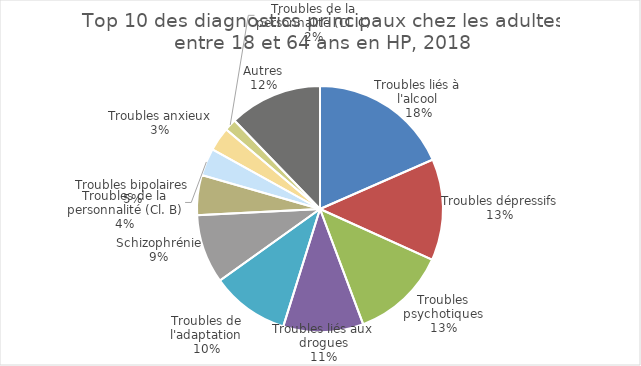
| Category | Fréquence |
|---|---|
| Troubles liés à l'alcool | 8206 |
| Troubles dépressifs | 5933 |
| Troubles psychotiques | 5582 |
| Troubles liés aux drogues | 4688 |
| Troubles de l'adaptation | 4582 |
| Schizophrénie | 4042 |
| Troubles bipolaires | 2337 |
| Troubles de la personnalité (Cl. B) | 1602 |
| Troubles anxieux | 1403 |
| Troubles de la personnalité (Cl. C) | 701 |
| Autres | 5445 |